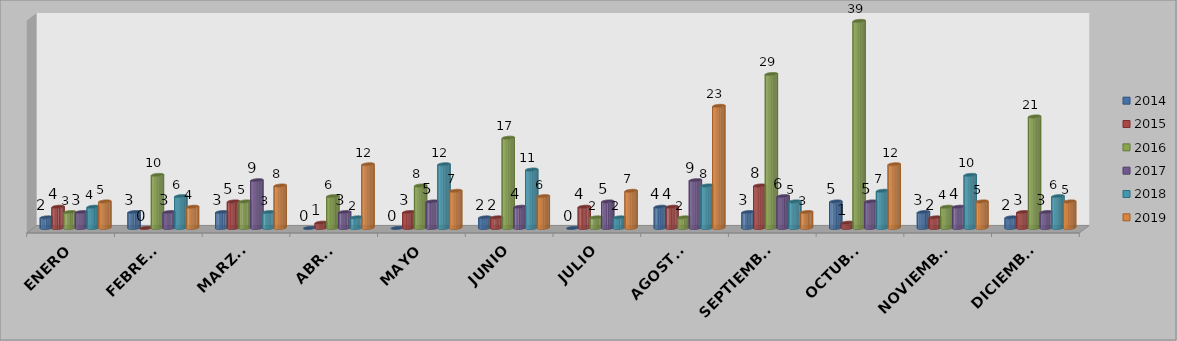
| Category | 2014 | 2015 | 2016 | 2017 | 2018 | 2019 |
|---|---|---|---|---|---|---|
| ENERO | 2 | 4 | 3 | 3 | 4 | 5 |
| FEBRERO | 3 | 0 | 10 | 3 | 6 | 4 |
| MARZO  | 3 | 5 | 5 | 9 | 3 | 8 |
| ABRIL | 0 | 1 | 6 | 3 | 2 | 12 |
| MAYO | 0 | 3 | 8 | 5 | 12 | 7 |
| JUNIO | 2 | 2 | 17 | 4 | 11 | 6 |
| JULIO | 0 | 4 | 2 | 5 | 2 | 7 |
| AGOSTO | 4 | 4 | 2 | 9 | 8 | 23 |
| SEPTIEMBRE | 3 | 8 | 29 | 6 | 5 | 3 |
| OCTUBRE | 5 | 1 | 39 | 5 | 7 | 12 |
| NOVIEMBRE | 3 | 2 | 4 | 4 | 10 | 5 |
| DICIEMBRE | 2 | 3 | 21 | 3 | 6 | 5 |